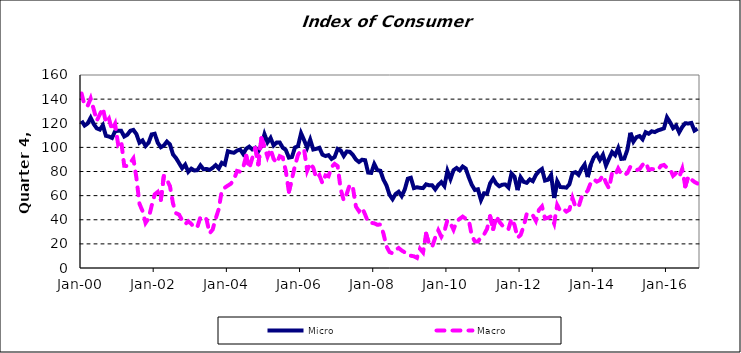
| Category | Micro | Macro |
|---|---|---|
| 2000-01-01 | 122.033 | 144.671 |
| 2000-02-01 | 118.105 | 134.882 |
| 2000-03-01 | 119.819 | 134.325 |
| 2000-04-01 | 124.551 | 140.55 |
| 2000-05-01 | 119.33 | 131.571 |
| 2000-06-01 | 115.783 | 122.098 |
| 2000-07-01 | 114.74 | 127.298 |
| 2000-08-01 | 118.335 | 132.499 |
| 2000-09-01 | 109.575 | 120.543 |
| 2000-10-01 | 108.971 | 123.829 |
| 2000-11-01 | 107.802 | 114.338 |
| 2000-12-01 | 113.366 | 119.46 |
| 2001-01-01 | 113.773 | 102.534 |
| 2001-02-01 | 113.735 | 105.651 |
| 2001-03-01 | 109.015 | 84.703 |
| 2001-04-01 | 110.436 | 84.473 |
| 2001-05-01 | 113.736 | 87.118 |
| 2001-06-01 | 114.486 | 90.818 |
| 2001-07-01 | 111.012 | 74.775 |
| 2001-08-01 | 103.878 | 53.261 |
| 2001-09-01 | 105.741 | 47.234 |
| 2001-10-01 | 101.178 | 37.34 |
| 2001-11-01 | 103.907 | 41.117 |
| 2001-12-01 | 110.732 | 51.622 |
| 2002-01-01 | 111.298 | 61.037 |
| 2002-02-01 | 103.823 | 63.09 |
| 2002-03-01 | 100.109 | 56.455 |
| 2002-04-01 | 101.571 | 76.317 |
| 2002-05-01 | 104.795 | 73.11 |
| 2002-06-01 | 102.425 | 67.887 |
| 2002-07-01 | 94.159 | 53.502 |
| 2002-08-01 | 91.072 | 45.419 |
| 2002-09-01 | 86.917 | 44.204 |
| 2002-10-01 | 82.722 | 39.545 |
| 2002-11-01 | 85.689 | 36.343 |
| 2002-12-01 | 79.713 | 38.753 |
| 2003-01-01 | 82.388 | 36.577 |
| 2003-02-01 | 80.847 | 33.369 |
| 2003-03-01 | 81.115 | 34.031 |
| 2003-04-01 | 85.079 | 42.287 |
| 2003-05-01 | 81.866 | 42.539 |
| 2003-06-01 | 82.117 | 40.282 |
| 2003-07-01 | 81.338 | 28.837 |
| 2003-08-01 | 82.985 | 31.817 |
| 2003-09-01 | 85.27 | 40.978 |
| 2003-10-01 | 82.466 | 48.873 |
| 2003-11-01 | 87.201 | 64.199 |
| 2003-12-01 | 85.816 | 66.62 |
| 2004-01-01 | 96.832 | 68.309 |
| 2004-02-01 | 95.966 | 69.934 |
| 2004-03-01 | 95.537 | 73.372 |
| 2004-04-01 | 97.339 | 80.474 |
| 2004-05-01 | 98.249 | 79.815 |
| 2004-06-01 | 94.528 | 83.165 |
| 2004-07-01 | 98.869 | 93.011 |
| 2004-08-01 | 100.572 | 82.665 |
| 2004-09-01 | 98.328 | 90.996 |
| 2004-10-01 | 99.702 | 99.46 |
| 2004-11-01 | 96.854 | 85.949 |
| 2004-12-01 | 101.457 | 107.618 |
| 2005-01-01 | 110.889 | 100.362 |
| 2005-02-01 | 104.199 | 92.201 |
| 2005-03-01 | 107.819 | 98.654 |
| 2005-04-01 | 101.622 | 90.447 |
| 2005-05-01 | 103.977 | 87.074 |
| 2005-06-01 | 104.029 | 92.703 |
| 2005-07-01 | 99.703 | 91.564 |
| 2005-08-01 | 97.814 | 80.315 |
| 2005-09-01 | 91.518 | 63.251 |
| 2005-10-01 | 92.015 | 73.91 |
| 2005-11-01 | 99.86 | 84.733 |
| 2005-12-01 | 101.062 | 93.832 |
| 2006-01-01 | 111.716 | 97.487 |
| 2006-02-01 | 105.951 | 98.115 |
| 2006-03-01 | 99.751 | 80.696 |
| 2006-04-01 | 106.433 | 86.913 |
| 2006-05-01 | 98.219 | 83.055 |
| 2006-06-01 | 98.819 | 74.517 |
| 2006-07-01 | 99.681 | 77.025 |
| 2006-08-01 | 94.061 | 70.371 |
| 2006-09-01 | 92.803 | 76.745 |
| 2006-10-01 | 93.565 | 75.992 |
| 2006-11-01 | 90.419 | 83.849 |
| 2006-12-01 | 91.975 | 86.292 |
| 2007-01-01 | 98.727 | 84.465 |
| 2007-02-01 | 97.397 | 65.219 |
| 2007-03-01 | 92.868 | 56.066 |
| 2007-04-01 | 96.613 | 61.673 |
| 2007-05-01 | 96.293 | 69.187 |
| 2007-06-01 | 93.701 | 66.663 |
| 2007-07-01 | 89.885 | 50.902 |
| 2007-08-01 | 87.895 | 47.023 |
| 2007-09-01 | 89.772 | 49.961 |
| 2007-10-01 | 89.38 | 44.383 |
| 2007-11-01 | 79.107 | 37.98 |
| 2007-12-01 | 78.83 | 37.396 |
| 2008-01-01 | 86.152 | 37.032 |
| 2008-02-01 | 81.158 | 35.843 |
| 2008-03-01 | 80.614 | 36.057 |
| 2008-04-01 | 73.365 | 28.709 |
| 2008-05-01 | 68.532 | 17.924 |
| 2008-06-01 | 60.753 | 13.212 |
| 2008-07-01 | 57.067 | 12.218 |
| 2008-08-01 | 61.362 | 15.19 |
| 2008-09-01 | 63.182 | 16.573 |
| 2008-10-01 | 59.597 | 14.509 |
| 2008-11-01 | 65.044 | 13.008 |
| 2008-12-01 | 74.037 | 12.732 |
| 2009-01-01 | 74.813 | 10.148 |
| 2009-02-01 | 66.234 | 9.687 |
| 2009-03-01 | 66.914 | 8.374 |
| 2009-04-01 | 66.462 | 15.929 |
| 2009-05-01 | 66.249 | 12.941 |
| 2009-06-01 | 69.369 | 28.367 |
| 2009-07-01 | 68.562 | 19.654 |
| 2009-08-01 | 68.508 | 17.736 |
| 2009-09-01 | 65.205 | 25.189 |
| 2009-10-01 | 68.847 | 31.248 |
| 2009-11-01 | 71.206 | 25.965 |
| 2009-12-01 | 67.933 | 30.464 |
| 2010-01-01 | 80.46 | 39.698 |
| 2010-02-01 | 73.762 | 36.857 |
| 2010-03-01 | 81.099 | 31.728 |
| 2010-04-01 | 82.921 | 38.543 |
| 2010-05-01 | 80.948 | 40.752 |
| 2010-06-01 | 84.12 | 42.589 |
| 2010-07-01 | 82.416 | 40.833 |
| 2010-08-01 | 75.19 | 39.865 |
| 2010-09-01 | 68.892 | 26.5 |
| 2010-10-01 | 64.678 | 22.114 |
| 2010-11-01 | 65.258 | 21.902 |
| 2010-12-01 | 56.36 | 25.595 |
| 2011-01-01 | 61.969 | 27.799 |
| 2011-02-01 | 61.673 | 32.47 |
| 2011-03-01 | 70.177 | 42.848 |
| 2011-04-01 | 74.165 | 32.312 |
| 2011-05-01 | 69.918 | 42.834 |
| 2011-06-01 | 67.815 | 38.389 |
| 2011-07-01 | 69.069 | 35.273 |
| 2011-08-01 | 69.234 | 34.831 |
| 2011-09-01 | 66.786 | 32.117 |
| 2011-10-01 | 78.388 | 40.8 |
| 2011-11-01 | 75.704 | 35.595 |
| 2011-12-01 | 64.555 | 25.16 |
| 2012-01-01 | 75.184 | 27.369 |
| 2012-02-01 | 71.453 | 34.446 |
| 2012-03-01 | 70.595 | 44.932 |
| 2012-04-01 | 73.447 | 45.431 |
| 2012-05-01 | 71.993 | 43.675 |
| 2012-06-01 | 77.136 | 39.087 |
| 2012-07-01 | 80.219 | 48.144 |
| 2012-08-01 | 82.064 | 51.026 |
| 2012-09-01 | 72.491 | 41.041 |
| 2012-10-01 | 73.184 | 41.57 |
| 2012-11-01 | 77.116 | 42.83 |
| 2012-12-01 | 58.007 | 36.826 |
| 2013-01-01 | 71.927 | 52.222 |
| 2013-02-01 | 67.059 | 47.322 |
| 2013-03-01 | 67.025 | 48.915 |
| 2013-04-01 | 66.604 | 46.767 |
| 2013-05-01 | 69.425 | 48.305 |
| 2013-06-01 | 78.546 | 58.062 |
| 2013-07-01 | 79.477 | 50.626 |
| 2013-08-01 | 77.21 | 50.537 |
| 2013-09-01 | 82.198 | 58.731 |
| 2013-10-01 | 85.8 | 61.229 |
| 2013-11-01 | 75.397 | 64.171 |
| 2013-12-01 | 85.658 | 70.563 |
| 2014-01-01 | 91.696 | 73.432 |
| 2014-02-01 | 94.349 | 71.59 |
| 2014-03-01 | 89.573 | 72.863 |
| 2014-04-01 | 93.851 | 76.847 |
| 2014-05-01 | 84.933 | 70.696 |
| 2014-06-01 | 90.66 | 66.036 |
| 2014-07-01 | 96.09 | 78.863 |
| 2014-08-01 | 93.547 | 77.04 |
| 2014-09-01 | 99.374 | 82.468 |
| 2014-10-01 | 90.433 | 77.852 |
| 2014-11-01 | 90.718 | 76.926 |
| 2014-12-01 | 97.916 | 78.77 |
| 2015-01-01 | 112.11 | 83.893 |
| 2015-02-01 | 104.773 | 82.509 |
| 2015-03-01 | 108.482 | 81.126 |
| 2015-04-01 | 109.378 | 82.069 |
| 2015-05-01 | 106.713 | 85.52 |
| 2015-06-01 | 112.594 | 87.557 |
| 2015-07-01 | 111.305 | 81.482 |
| 2015-08-01 | 113.343 | 82.014 |
| 2015-09-01 | 112.684 | 81.792 |
| 2015-10-01 | 114.077 | 81.192 |
| 2015-11-01 | 114.85 | 84.711 |
| 2015-12-01 | 115.748 | 85.413 |
| 2016-01-01 | 124.905 | 83.115 |
| 2016-02-01 | 120.897 | 82.05 |
| 2016-03-01 | 115.972 | 76.426 |
| 2016-04-01 | 118.044 | 78.696 |
| 2016-05-01 | 112.483 | 75.465 |
| 2016-06-01 | 116.907 | 82.208 |
| 2016-07-01 | 120.018 | 67.706 |
| 2016-08-01 | 119.781 | 75.928 |
| 2016-09-01 | 120.253 | 73.371 |
| 2016-10-01 | 113.922 | 71.373 |
| 2016-11-01 | 115.463 | 70.033 |